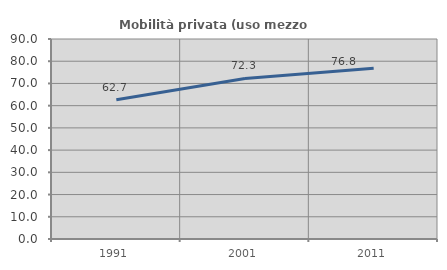
| Category | Mobilità privata (uso mezzo privato) |
|---|---|
| 1991.0 | 62.67 |
| 2001.0 | 72.257 |
| 2011.0 | 76.79 |